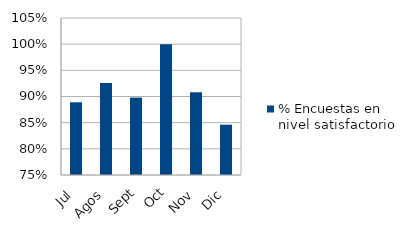
| Category | % Encuestas en nivel satisfactorio |
|---|---|
| Jul | 0.889 |
| Agos | 0.926 |
| Sept | 0.898 |
| Oct | 1 |
| Nov | 0.908 |
| Dic | 0.846 |